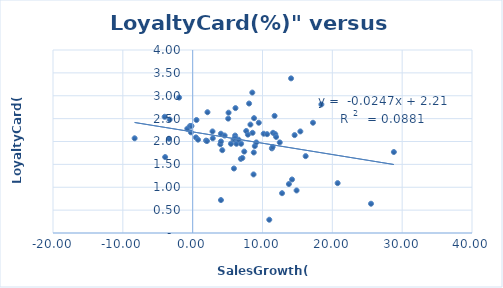
| Category | LoyaltyCard% |
|---|---|
| -8.31 | 2.07 |
| -4.01 | 2.54 |
| -3.94 | 1.66 |
| -3.39 | 2.06 |
| -3.3 | 2.48 |
| -1.94 | 2.96 |
| -0.77 | 2.28 |
| -0.37 | 2.34 |
| -0.25 | 2.2 |
| -0.17 | 2.34 |
| 0.47 | 2.09 |
| 0.55 | 2.47 |
| 0.77 | 2.04 |
| 1.92 | 2.02 |
| 2.05 | 2.01 |
| 2.12 | 2.64 |
| 2.84 | 2.22 |
| 2.88 | 2.07 |
| 3.96 | 1.94 |
| 4.04 | 2.17 |
| 4.05 | 0.72 |
| 4.05 | 2 |
| 4.24 | 1.81 |
| 4.58 | 2.13 |
| 5.09 | 2.5 |
| 5.14 | 2.63 |
| 5.48 | 1.95 |
| 5.86 | 2.04 |
| 5.91 | 1.41 |
| 5.98 | 2.05 |
| 6.08 | 2.13 |
| 6.08 | 2.08 |
| 6.13 | 2.73 |
| 6.27 | 1.95 |
| 6.57 | 2.04 |
| 6.9 | 1.62 |
| 6.94 | 1.95 |
| 7.12 | 1.64 |
| 7.39 | 1.78 |
| 7.67 | 2.23 |
| 7.91 | 2.15 |
| 8.08 | 2.83 |
| 8.27 | 2.37 |
| 8.54 | 3.07 |
| 8.58 | 2.19 |
| 8.72 | 1.28 |
| 8.75 | 1.76 |
| 8.79 | 2.51 |
| 8.9 | 1.9 |
| 9.12 | 1.98 |
| 9.47 | 2.41 |
| 10.17 | 2.17 |
| 10.66 | 2.16 |
| 10.97 | 0.29 |
| 11.34 | 1.85 |
| 11.45 | 1.88 |
| 11.51 | 2.19 |
| 11.73 | 2.56 |
| 11.83 | 2.16 |
| 11.95 | 2.1 |
| 12.47 | 1.98 |
| 12.8 | 0.87 |
| 13.78 | 1.07 |
| 14.09 | 3.38 |
| 14.23 | 1.17 |
| 14.6 | 2.14 |
| 14.88 | 0.93 |
| 15.42 | 2.22 |
| 16.18 | 1.68 |
| 17.23 | 2.41 |
| 18.43 | 2.81 |
| 20.76 | 1.09 |
| 25.54 | 0.64 |
| 28.81 | 1.77 |